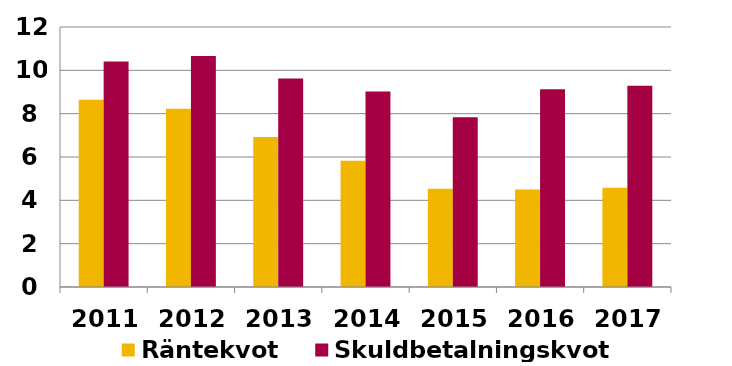
| Category | Räntekvot | Skuldbetalningskvot |
|---|---|---|
| 2011.0 | 8.64 | 10.41 |
| 2012.0 | 8.23 | 10.66 |
| 2013.0 | 6.92 | 9.62 |
| 2014.0 | 5.83 | 9.02 |
| 2015.0 | 4.54 | 7.84 |
| 2016.0 | 4.5 | 9.13 |
| 2017.0 | 4.58 | 9.29 |